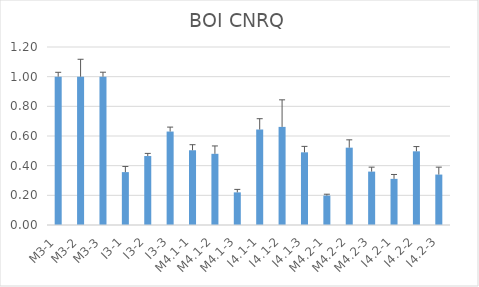
| Category | BOI CNRQ |
|---|---|
| M3-1 | 1 |
| M3-2 | 1 |
| M3-3 | 1 |
| I3-1 | 0.356 |
| I3-2 | 0.465 |
| I3-3 | 0.63 |
| M4.1-1 | 0.504 |
| M4.1-2 | 0.48 |
| M4.1-3 | 0.22 |
| I4.1-1 | 0.644 |
| I4.1-2 | 0.661 |
| I4.1-3 | 0.49 |
| M4.2-1 | 0.198 |
| M4.2-2 | 0.521 |
| M4.2-3 | 0.36 |
| I4.2-1 | 0.311 |
| I4.2-2 | 0.497 |
| I4.2-3 | 0.34 |